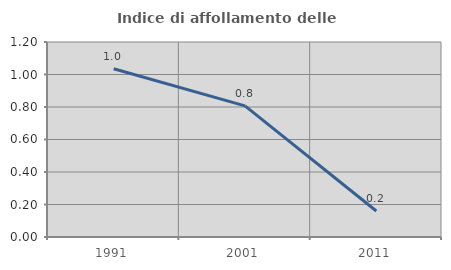
| Category | Indice di affollamento delle abitazioni  |
|---|---|
| 1991.0 | 1.035 |
| 2001.0 | 0.807 |
| 2011.0 | 0.16 |